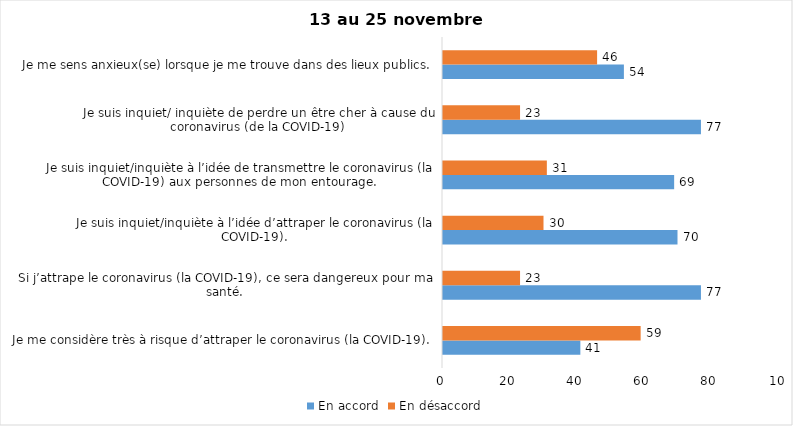
| Category | En accord | En désaccord |
|---|---|---|
| Je me considère très à risque d’attraper le coronavirus (la COVID-19). | 41 | 59 |
| Si j’attrape le coronavirus (la COVID-19), ce sera dangereux pour ma santé. | 77 | 23 |
| Je suis inquiet/inquiète à l’idée d’attraper le coronavirus (la COVID-19). | 70 | 30 |
| Je suis inquiet/inquiète à l’idée de transmettre le coronavirus (la COVID-19) aux personnes de mon entourage. | 69 | 31 |
| Je suis inquiet/ inquiète de perdre un être cher à cause du coronavirus (de la COVID-19) | 77 | 23 |
| Je me sens anxieux(se) lorsque je me trouve dans des lieux publics. | 54 | 46 |